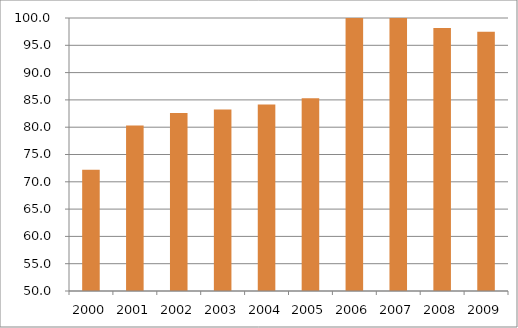
| Category | Região Norte |
|---|---|
| 2000.0 | 72.21 |
| 2001.0 | 80.33 |
| 2002.0 | 82.59 |
| 2003.0 | 83.23 |
| 2004.0 | 84.14 |
| 2005.0 | 85.29 |
| 2006.0 | 100 |
| 2007.0 | 100.24 |
| 2008.0 | 98.17 |
| 2009.0 | 97.5 |